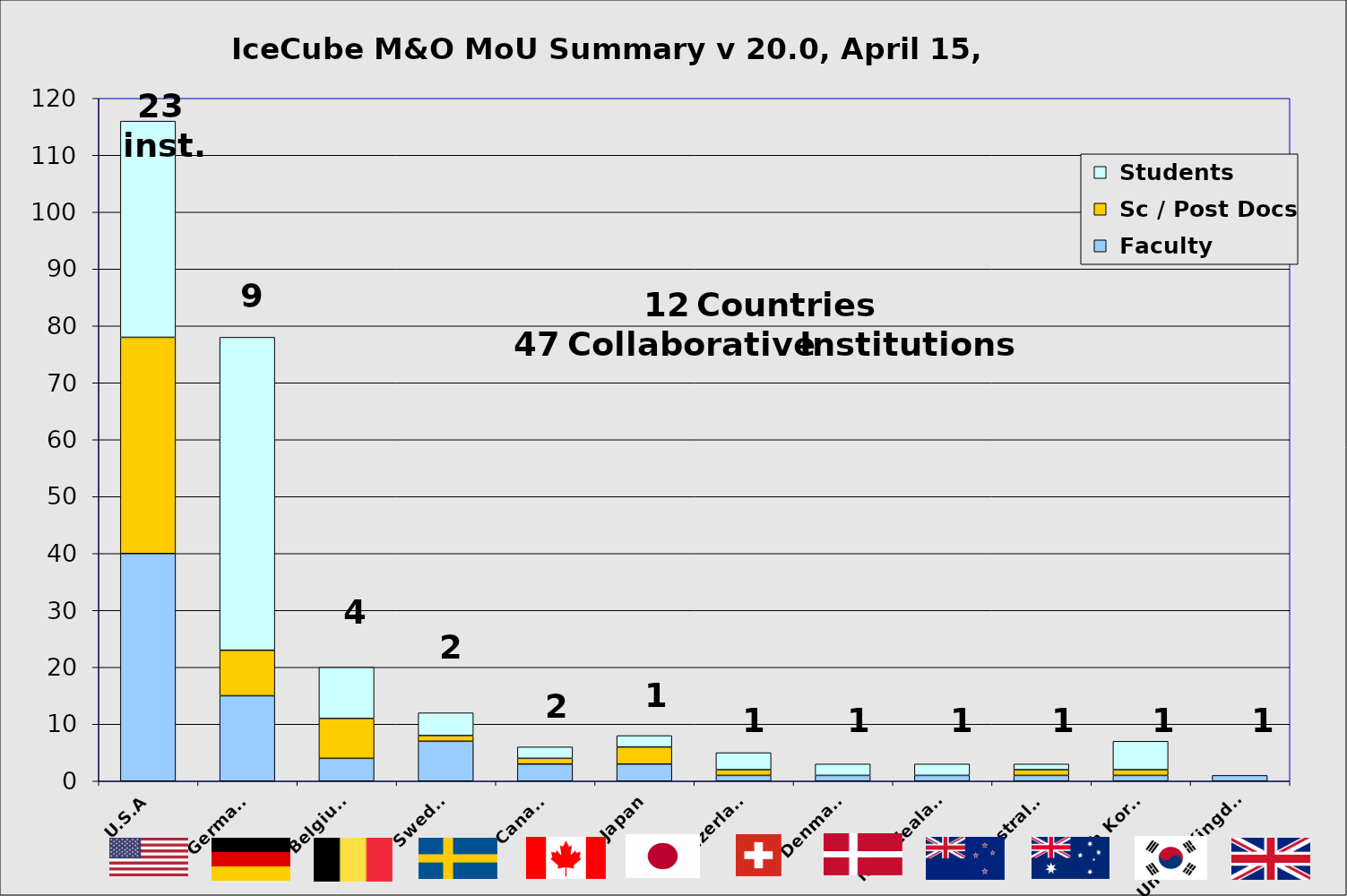
| Category |  Faculty |  Sc / Post Docs |  Students |
|---|---|---|---|
| U.S.A | 40 | 38 | 38 |
| Germany | 15 | 8 | 55 |
| Belgium | 4 | 7 | 9 |
| Sweden | 7 | 1 | 4 |
| Canada | 3 | 1 | 2 |
| Japan | 3 | 3 | 2 |
| Switzerland | 1 | 1 | 3 |
| Denmark | 1 | 0 | 2 |
| New Zealand | 1 | 0 | 2 |
| Australia | 1 | 1 | 1 |
| South Korea | 1 | 1 | 5 |
| United Kingdom | 1 | 0 | 0 |